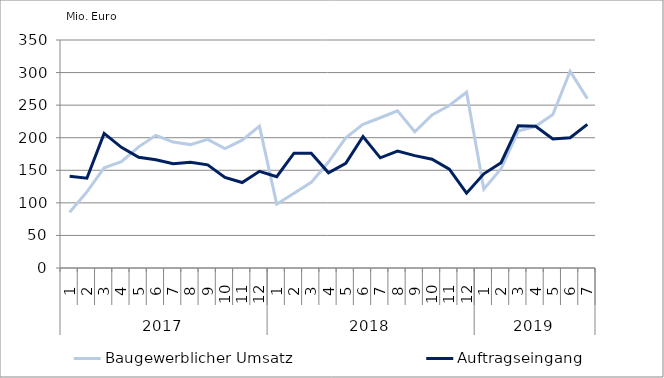
| Category | Baugewerblicher Umsatz | Auftragseingang |
|---|---|---|
| 0 | 85701.947 | 140751.008 |
| 1 | 116743.276 | 137863.383 |
| 2 | 153810.055 | 206710.579 |
| 3 | 163342.989 | 185183.797 |
| 4 | 185946.221 | 169878.51 |
| 5 | 203627.91 | 166148.392 |
| 6 | 193377.256 | 160134.206 |
| 7 | 189429.952 | 162221.206 |
| 8 | 197405.279 | 158305.285 |
| 9 | 183450.026 | 139156.761 |
| 10 | 196209.214 | 131165.419 |
| 11 | 217688.447 | 148434.901 |
| 12 | 97959.056 | 140119.385 |
| 13 | 114756.787 | 176330.213 |
| 14 | 131454.642 | 176241.061 |
| 15 | 162648.053 | 146063.407 |
| 16 | 199809.407 | 160551.931 |
| 17 | 220535.974 | 201835.846 |
| 18 | 230672.472 | 169132.23 |
| 19 | 241233.619 | 179396.293 |
| 20 | 209099.292 | 172542.764 |
| 21 | 234953.007 | 166991.729 |
| 22 | 249410.043 | 151835.629 |
| 23 | 269773.227 | 114807.456 |
| 24 | 120975.133 | 144510.881 |
| 25 | 152329.786 | 161685.201 |
| 26 | 210227.67 | 218455.879 |
| 27 | 217522.321 | 217610.064 |
| 28 | 235490.429 | 198110.439 |
| 29 | 301963.302 | 200012.086 |
| 30 | 259975.317 | 220559.061 |